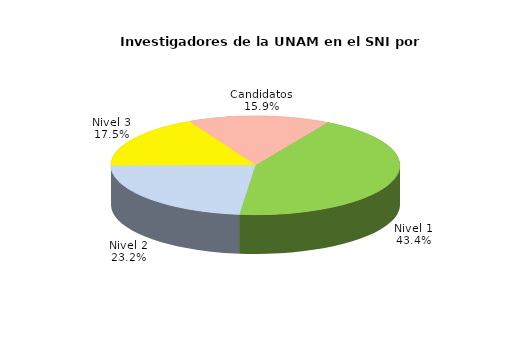
| Category | Series 0 |
|---|---|
| Nivel 1 | 2090 |
| Nivel 2 | 1114 |
| Nivel 3 | 841 |
| Candidatos | 767 |